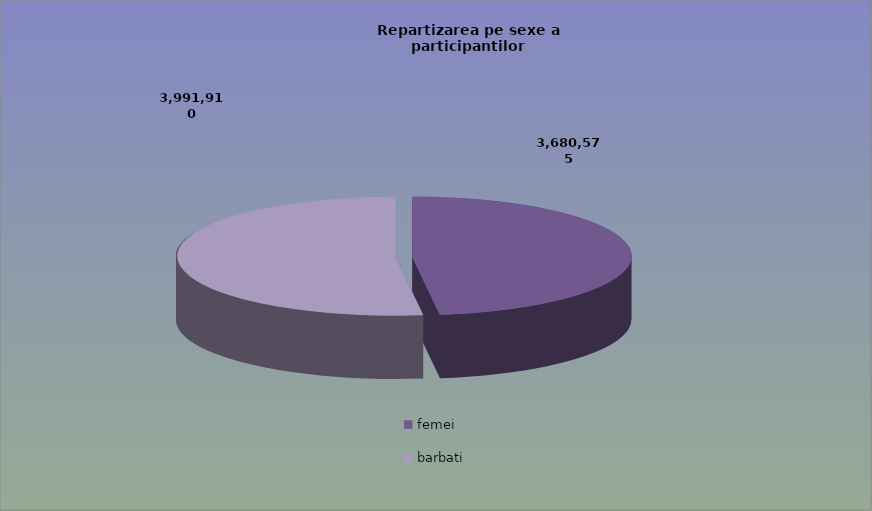
| Category | Series 0 |
|---|---|
| femei | 3680575 |
| barbati | 3991910 |